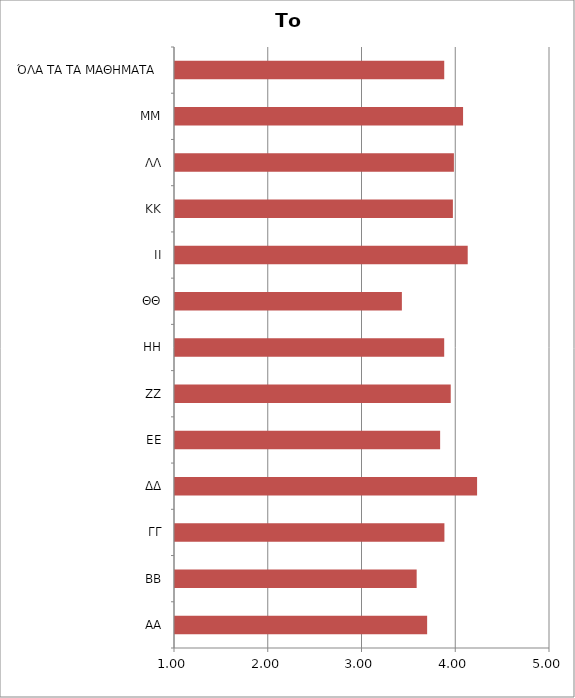
| Category | Το Μάθημα |
|---|---|
| ΑΑ | 3.689 |
| ΒΒ | 3.578 |
| ΓΓ | 3.874 |
| ΔΔ | 4.222 |
| ΕΕ | 3.828 |
| ΖΖ | 3.941 |
| ΗΗ | 3.871 |
| ΘΘ | 3.42 |
| ΙΙ | 4.122 |
| ΚΚ | 3.964 |
| ΛΛ | 3.975 |
| ΜΜ | 4.073 |
| ΌΛΑ ΤΑ ΤΑ ΜΑΘΗΜΑΤΑ  | 3.872 |